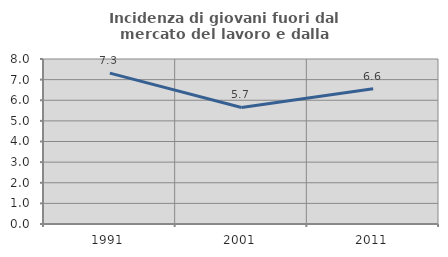
| Category | Incidenza di giovani fuori dal mercato del lavoro e dalla formazione  |
|---|---|
| 1991.0 | 7.315 |
| 2001.0 | 5.652 |
| 2011.0 | 6.56 |